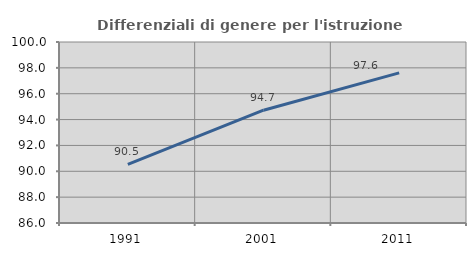
| Category | Differenziali di genere per l'istruzione superiore |
|---|---|
| 1991.0 | 90.529 |
| 2001.0 | 94.726 |
| 2011.0 | 97.609 |